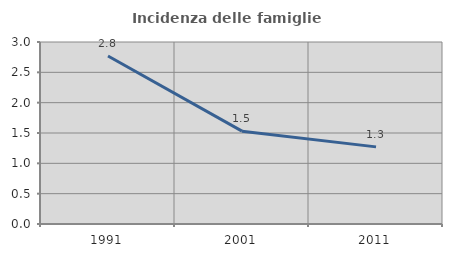
| Category | Incidenza delle famiglie numerose |
|---|---|
| 1991.0 | 2.768 |
| 2001.0 | 1.531 |
| 2011.0 | 1.271 |